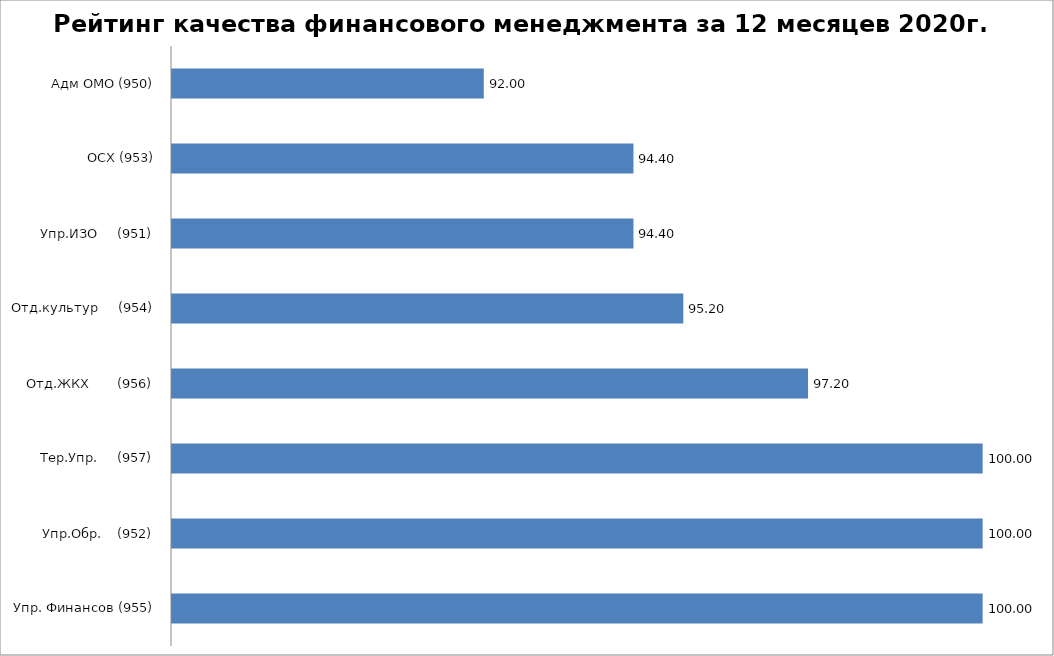
| Category | Series 0 |
|---|---|
| Упр. Финансов (955) | 100 |
| Упр.Обр.    (952) | 100 |
| Тер.Упр.     (957) | 100 |
| Отд.ЖКХ       (956) | 97.2 |
| Отд.культур     (954) | 95.2 |
| Упр.ИЗО     (951) | 94.4 |
| ОСХ (953) | 94.4 |
| Адм ОМО (950) | 92 |